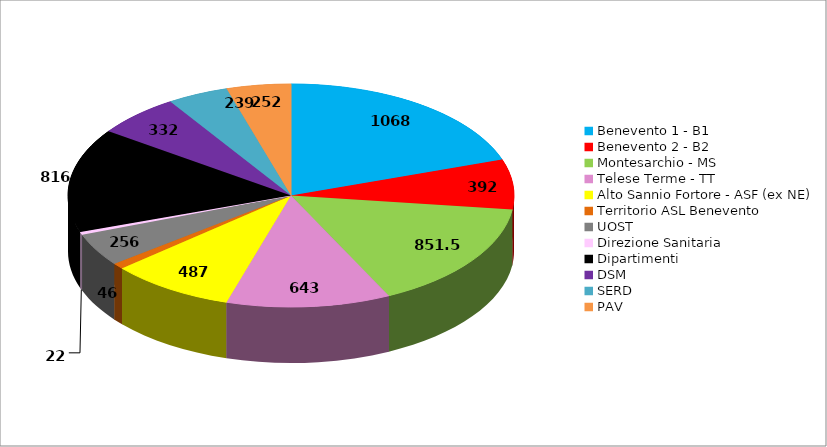
| Category | Series 0 |
|---|---|
| Benevento 1 - B1 | 1068 |
| Benevento 2 - B2 | 392 |
| Montesarchio - MS | 851.5 |
| Telese Terme - TT | 643 |
| Alto Sannio Fortore - ASF (ex NE) | 487 |
| Territorio ASL Benevento | 46 |
| UOST | 256 |
| Direzione Sanitaria | 22 |
| Dipartimenti | 816 |
| DSM | 332 |
| SERD | 239 |
| PAV | 252 |